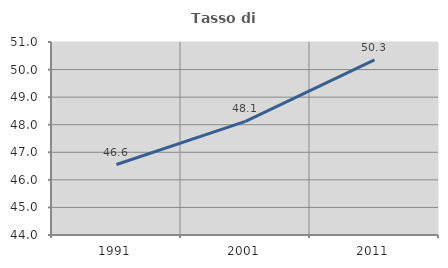
| Category | Tasso di occupazione   |
|---|---|
| 1991.0 | 46.556 |
| 2001.0 | 48.12 |
| 2011.0 | 50.35 |